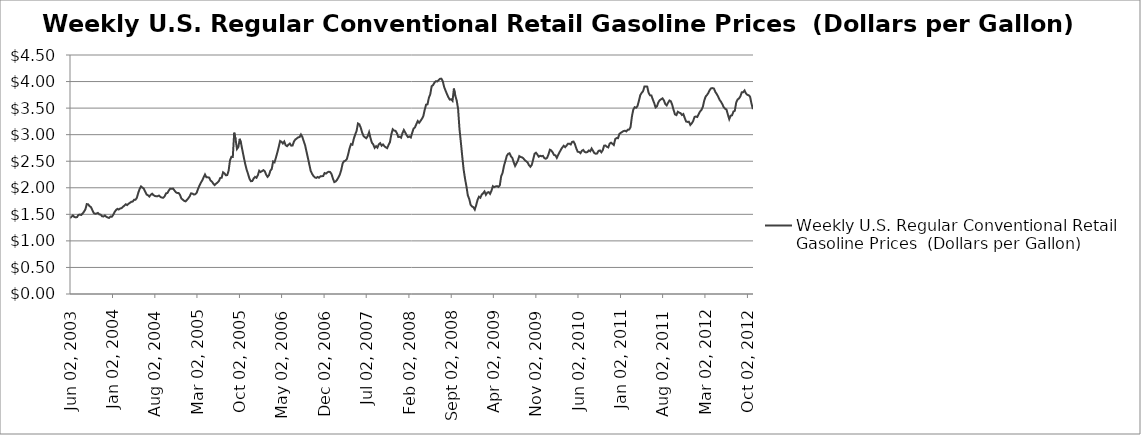
| Category | Weekly U.S. Regular Conventional Retail Gasoline Prices  (Dollars per Gallon) |
|---|---|
| 2003-06-02 | 1.428 |
| 2003-06-09 | 1.456 |
| 2003-06-16 | 1.48 |
| 2003-06-23 | 1.451 |
| 2003-06-30 | 1.443 |
| 2003-07-07 | 1.448 |
| 2003-07-14 | 1.489 |
| 2003-07-21 | 1.496 |
| 2003-07-28 | 1.488 |
| 2003-08-04 | 1.516 |
| 2003-08-11 | 1.55 |
| 2003-08-18 | 1.594 |
| 2003-08-25 | 1.693 |
| 2003-09-01 | 1.688 |
| 2003-09-08 | 1.653 |
| 2003-09-15 | 1.636 |
| 2003-09-22 | 1.58 |
| 2003-09-29 | 1.524 |
| 2003-10-06 | 1.511 |
| 2003-10-13 | 1.515 |
| 2003-10-20 | 1.527 |
| 2003-10-27 | 1.499 |
| 2003-11-03 | 1.494 |
| 2003-11-10 | 1.464 |
| 2003-11-17 | 1.459 |
| 2003-11-24 | 1.478 |
| 2003-12-01 | 1.454 |
| 2003-12-08 | 1.441 |
| 2003-12-15 | 1.433 |
| 2003-12-22 | 1.459 |
| 2003-12-29 | 1.454 |
| 2004-01-05 | 1.492 |
| 2004-01-12 | 1.544 |
| 2004-01-19 | 1.579 |
| 2004-01-26 | 1.604 |
| 2004-02-02 | 1.591 |
| 2004-02-09 | 1.609 |
| 2004-02-16 | 1.617 |
| 2004-02-23 | 1.641 |
| 2004-03-01 | 1.664 |
| 2004-03-08 | 1.69 |
| 2004-03-15 | 1.675 |
| 2004-03-22 | 1.698 |
| 2004-03-29 | 1.716 |
| 2004-04-05 | 1.737 |
| 2004-04-12 | 1.74 |
| 2004-04-19 | 1.773 |
| 2004-04-26 | 1.774 |
| 2004-05-03 | 1.811 |
| 2004-05-10 | 1.904 |
| 2004-05-17 | 1.979 |
| 2004-05-24 | 2.026 |
| 2004-05-31 | 2.004 |
| 2004-06-07 | 1.983 |
| 2004-06-14 | 1.926 |
| 2004-06-21 | 1.873 |
| 2004-06-28 | 1.859 |
| 2004-07-05 | 1.835 |
| 2004-07-12 | 1.869 |
| 2004-07-19 | 1.888 |
| 2004-07-26 | 1.861 |
| 2004-08-02 | 1.846 |
| 2004-08-09 | 1.839 |
| 2004-08-16 | 1.842 |
| 2004-08-23 | 1.854 |
| 2004-08-30 | 1.827 |
| 2004-09-06 | 1.815 |
| 2004-09-13 | 1.813 |
| 2004-09-20 | 1.839 |
| 2004-09-27 | 1.895 |
| 2004-10-04 | 1.902 |
| 2004-10-11 | 1.949 |
| 2004-10-18 | 1.984 |
| 2004-10-25 | 1.98 |
| 2004-11-01 | 1.986 |
| 2004-11-08 | 1.951 |
| 2004-11-15 | 1.918 |
| 2004-11-22 | 1.901 |
| 2004-11-29 | 1.903 |
| 2004-12-06 | 1.868 |
| 2004-12-13 | 1.799 |
| 2004-12-20 | 1.777 |
| 2004-12-27 | 1.754 |
| 2005-01-03 | 1.745 |
| 2005-01-10 | 1.771 |
| 2005-01-17 | 1.802 |
| 2005-01-24 | 1.839 |
| 2005-01-31 | 1.896 |
| 2005-02-07 | 1.89 |
| 2005-02-14 | 1.873 |
| 2005-02-21 | 1.878 |
| 2005-02-28 | 1.904 |
| 2005-03-07 | 1.979 |
| 2005-03-14 | 2.039 |
| 2005-03-21 | 2.095 |
| 2005-03-28 | 2.137 |
| 2005-04-04 | 2.196 |
| 2005-04-11 | 2.251 |
| 2005-04-18 | 2.198 |
| 2005-04-25 | 2.197 |
| 2005-05-02 | 2.191 |
| 2005-05-09 | 2.137 |
| 2005-05-16 | 2.116 |
| 2005-05-23 | 2.077 |
| 2005-05-30 | 2.051 |
| 2005-06-06 | 2.078 |
| 2005-06-13 | 2.099 |
| 2005-06-20 | 2.128 |
| 2005-06-27 | 2.186 |
| 2005-07-04 | 2.189 |
| 2005-07-11 | 2.292 |
| 2005-07-18 | 2.272 |
| 2005-07-25 | 2.235 |
| 2005-08-01 | 2.239 |
| 2005-08-08 | 2.323 |
| 2005-08-15 | 2.519 |
| 2005-08-22 | 2.583 |
| 2005-08-29 | 2.581 |
| 2005-09-05 | 3.037 |
| 2005-09-12 | 2.912 |
| 2005-09-19 | 2.73 |
| 2005-09-26 | 2.767 |
| 2005-10-03 | 2.922 |
| 2005-10-10 | 2.828 |
| 2005-10-17 | 2.693 |
| 2005-10-24 | 2.564 |
| 2005-10-31 | 2.438 |
| 2005-11-07 | 2.336 |
| 2005-11-14 | 2.258 |
| 2005-11-21 | 2.168 |
| 2005-11-28 | 2.124 |
| 2005-12-05 | 2.127 |
| 2005-12-12 | 2.175 |
| 2005-12-19 | 2.205 |
| 2005-12-26 | 2.188 |
| 2006-01-02 | 2.236 |
| 2006-01-09 | 2.321 |
| 2006-01-16 | 2.297 |
| 2006-01-23 | 2.314 |
| 2006-01-30 | 2.332 |
| 2006-02-06 | 2.31 |
| 2006-02-13 | 2.246 |
| 2006-02-20 | 2.205 |
| 2006-02-27 | 2.236 |
| 2006-03-06 | 2.321 |
| 2006-03-13 | 2.355 |
| 2006-03-20 | 2.495 |
| 2006-03-27 | 2.479 |
| 2006-04-03 | 2.567 |
| 2006-04-10 | 2.663 |
| 2006-04-17 | 2.764 |
| 2006-04-24 | 2.881 |
| 2006-05-01 | 2.866 |
| 2006-05-08 | 2.834 |
| 2006-05-15 | 2.871 |
| 2006-05-22 | 2.801 |
| 2006-05-29 | 2.784 |
| 2006-06-05 | 2.811 |
| 2006-06-12 | 2.833 |
| 2006-06-19 | 2.793 |
| 2006-06-26 | 2.796 |
| 2006-07-03 | 2.873 |
| 2006-07-10 | 2.91 |
| 2006-07-17 | 2.928 |
| 2006-07-24 | 2.95 |
| 2006-07-31 | 2.955 |
| 2006-08-07 | 3.004 |
| 2006-08-14 | 2.958 |
| 2006-08-21 | 2.877 |
| 2006-08-28 | 2.8 |
| 2006-09-04 | 2.68 |
| 2006-09-11 | 2.563 |
| 2006-09-18 | 2.441 |
| 2006-09-25 | 2.32 |
| 2006-10-02 | 2.263 |
| 2006-10-09 | 2.222 |
| 2006-10-16 | 2.195 |
| 2006-10-23 | 2.186 |
| 2006-10-30 | 2.204 |
| 2006-11-06 | 2.189 |
| 2006-11-13 | 2.216 |
| 2006-11-20 | 2.218 |
| 2006-11-27 | 2.221 |
| 2006-12-04 | 2.277 |
| 2006-12-11 | 2.267 |
| 2006-12-18 | 2.29 |
| 2006-12-25 | 2.303 |
| 2007-01-01 | 2.296 |
| 2007-01-08 | 2.258 |
| 2007-01-15 | 2.173 |
| 2007-01-22 | 2.107 |
| 2007-01-29 | 2.119 |
| 2007-02-05 | 2.151 |
| 2007-02-12 | 2.198 |
| 2007-02-19 | 2.251 |
| 2007-02-26 | 2.338 |
| 2007-03-05 | 2.46 |
| 2007-03-12 | 2.499 |
| 2007-03-19 | 2.511 |
| 2007-03-26 | 2.54 |
| 2007-04-02 | 2.636 |
| 2007-04-09 | 2.746 |
| 2007-04-16 | 2.822 |
| 2007-04-23 | 2.811 |
| 2007-04-30 | 2.922 |
| 2007-05-07 | 3.002 |
| 2007-05-14 | 3.069 |
| 2007-05-21 | 3.211 |
| 2007-05-28 | 3.195 |
| 2007-06-04 | 3.132 |
| 2007-06-11 | 3.04 |
| 2007-06-18 | 2.974 |
| 2007-06-25 | 2.951 |
| 2007-07-02 | 2.933 |
| 2007-07-09 | 2.971 |
| 2007-07-16 | 3.046 |
| 2007-07-23 | 2.938 |
| 2007-07-30 | 2.849 |
| 2007-08-06 | 2.816 |
| 2007-08-13 | 2.752 |
| 2007-08-20 | 2.783 |
| 2007-08-27 | 2.756 |
| 2007-09-03 | 2.818 |
| 2007-09-10 | 2.84 |
| 2007-09-17 | 2.792 |
| 2007-09-24 | 2.816 |
| 2007-10-01 | 2.784 |
| 2007-10-08 | 2.761 |
| 2007-10-15 | 2.746 |
| 2007-10-22 | 2.806 |
| 2007-10-29 | 2.859 |
| 2007-11-05 | 3.007 |
| 2007-11-12 | 3.101 |
| 2007-11-19 | 3.077 |
| 2007-11-26 | 3.072 |
| 2007-12-03 | 3.029 |
| 2007-12-10 | 2.957 |
| 2007-12-17 | 2.962 |
| 2007-12-24 | 2.943 |
| 2007-12-31 | 3.028 |
| 2008-01-07 | 3.088 |
| 2008-01-14 | 3.041 |
| 2008-01-21 | 2.991 |
| 2008-01-28 | 2.953 |
| 2008-02-04 | 2.966 |
| 2008-02-11 | 2.947 |
| 2008-02-18 | 3.035 |
| 2008-02-25 | 3.115 |
| 2008-03-03 | 3.137 |
| 2008-03-10 | 3.2 |
| 2008-03-17 | 3.257 |
| 2008-03-24 | 3.224 |
| 2008-03-31 | 3.259 |
| 2008-04-07 | 3.299 |
| 2008-04-14 | 3.35 |
| 2008-04-21 | 3.467 |
| 2008-04-28 | 3.566 |
| 2008-05-05 | 3.571 |
| 2008-05-12 | 3.694 |
| 2008-05-19 | 3.762 |
| 2008-05-26 | 3.913 |
| 2008-06-02 | 3.932 |
| 2008-06-09 | 3.979 |
| 2008-06-16 | 4.007 |
| 2008-06-23 | 4.002 |
| 2008-06-30 | 4.027 |
| 2008-07-07 | 4.051 |
| 2008-07-14 | 4.054 |
| 2008-07-21 | 4.005 |
| 2008-07-28 | 3.896 |
| 2008-08-04 | 3.828 |
| 2008-08-11 | 3.764 |
| 2008-08-18 | 3.706 |
| 2008-08-25 | 3.66 |
| 2008-09-01 | 3.667 |
| 2008-09-08 | 3.637 |
| 2008-09-15 | 3.867 |
| 2008-09-22 | 3.732 |
| 2008-09-29 | 3.644 |
| 2008-10-06 | 3.485 |
| 2008-10-13 | 3.109 |
| 2008-10-20 | 2.855 |
| 2008-10-27 | 2.589 |
| 2008-11-03 | 2.34 |
| 2008-11-10 | 2.17 |
| 2008-11-17 | 2.027 |
| 2008-11-24 | 1.857 |
| 2008-12-01 | 1.79 |
| 2008-12-08 | 1.681 |
| 2008-12-15 | 1.648 |
| 2008-12-22 | 1.635 |
| 2008-12-29 | 1.59 |
| 2009-01-05 | 1.672 |
| 2009-01-12 | 1.772 |
| 2009-01-19 | 1.832 |
| 2009-01-26 | 1.813 |
| 2009-02-02 | 1.871 |
| 2009-02-09 | 1.897 |
| 2009-02-16 | 1.931 |
| 2009-02-23 | 1.868 |
| 2009-03-02 | 1.91 |
| 2009-03-09 | 1.918 |
| 2009-03-16 | 1.885 |
| 2009-03-23 | 1.944 |
| 2009-03-30 | 2.03 |
| 2009-04-06 | 2.011 |
| 2009-04-13 | 2.025 |
| 2009-04-20 | 2.031 |
| 2009-04-27 | 2.016 |
| 2009-05-04 | 2.045 |
| 2009-05-11 | 2.218 |
| 2009-05-18 | 2.281 |
| 2009-05-25 | 2.414 |
| 2009-06-01 | 2.502 |
| 2009-06-08 | 2.6 |
| 2009-06-15 | 2.639 |
| 2009-06-22 | 2.65 |
| 2009-06-29 | 2.593 |
| 2009-07-06 | 2.563 |
| 2009-07-13 | 2.479 |
| 2009-07-20 | 2.411 |
| 2009-07-27 | 2.46 |
| 2009-08-03 | 2.511 |
| 2009-08-10 | 2.596 |
| 2009-08-17 | 2.58 |
| 2009-08-24 | 2.572 |
| 2009-08-31 | 2.553 |
| 2009-09-07 | 2.519 |
| 2009-09-14 | 2.499 |
| 2009-09-21 | 2.477 |
| 2009-09-28 | 2.425 |
| 2009-10-05 | 2.396 |
| 2009-10-12 | 2.432 |
| 2009-10-19 | 2.532 |
| 2009-10-26 | 2.641 |
| 2009-11-02 | 2.66 |
| 2009-11-09 | 2.627 |
| 2009-11-16 | 2.585 |
| 2009-11-23 | 2.603 |
| 2009-11-30 | 2.594 |
| 2009-12-07 | 2.601 |
| 2009-12-14 | 2.56 |
| 2009-12-21 | 2.546 |
| 2009-12-28 | 2.564 |
| 2010-01-04 | 2.627 |
| 2010-01-11 | 2.717 |
| 2010-01-18 | 2.703 |
| 2010-01-25 | 2.666 |
| 2010-02-01 | 2.618 |
| 2010-02-08 | 2.611 |
| 2010-02-15 | 2.563 |
| 2010-02-22 | 2.621 |
| 2010-03-01 | 2.671 |
| 2010-03-08 | 2.721 |
| 2010-03-15 | 2.76 |
| 2010-03-22 | 2.792 |
| 2010-03-29 | 2.765 |
| 2010-04-05 | 2.795 |
| 2010-04-12 | 2.829 |
| 2010-04-19 | 2.831 |
| 2010-04-26 | 2.815 |
| 2010-05-03 | 2.864 |
| 2010-05-10 | 2.87 |
| 2010-05-17 | 2.823 |
| 2010-05-24 | 2.741 |
| 2010-05-31 | 2.679 |
| 2010-06-07 | 2.674 |
| 2010-06-14 | 2.652 |
| 2010-06-21 | 2.696 |
| 2010-06-28 | 2.712 |
| 2010-07-05 | 2.676 |
| 2010-07-12 | 2.666 |
| 2010-07-19 | 2.672 |
| 2010-07-26 | 2.703 |
| 2010-08-02 | 2.687 |
| 2010-08-09 | 2.74 |
| 2010-08-16 | 2.696 |
| 2010-08-23 | 2.653 |
| 2010-08-30 | 2.64 |
| 2010-09-06 | 2.647 |
| 2010-09-13 | 2.695 |
| 2010-09-20 | 2.703 |
| 2010-09-27 | 2.668 |
| 2010-10-04 | 2.705 |
| 2010-10-11 | 2.793 |
| 2010-10-18 | 2.795 |
| 2010-10-25 | 2.772 |
| 2010-11-01 | 2.76 |
| 2010-11-08 | 2.832 |
| 2010-11-15 | 2.849 |
| 2010-11-22 | 2.828 |
| 2010-11-29 | 2.805 |
| 2010-12-06 | 2.917 |
| 2010-12-13 | 2.937 |
| 2010-12-20 | 2.934 |
| 2010-12-27 | 3.015 |
| 2011-01-03 | 3.034 |
| 2011-01-10 | 3.052 |
| 2011-01-17 | 3.068 |
| 2011-01-24 | 3.074 |
| 2011-01-31 | 3.061 |
| 2011-02-07 | 3.094 |
| 2011-02-14 | 3.095 |
| 2011-02-21 | 3.141 |
| 2011-02-28 | 3.341 |
| 2011-03-07 | 3.473 |
| 2011-03-14 | 3.517 |
| 2011-03-21 | 3.507 |
| 2011-03-28 | 3.538 |
| 2011-04-04 | 3.635 |
| 2011-04-11 | 3.743 |
| 2011-04-18 | 3.787 |
| 2011-04-25 | 3.817 |
| 2011-05-02 | 3.906 |
| 2011-05-09 | 3.907 |
| 2011-05-16 | 3.905 |
| 2011-05-23 | 3.788 |
| 2011-05-30 | 3.741 |
| 2011-06-06 | 3.738 |
| 2011-06-13 | 3.664 |
| 2011-06-20 | 3.597 |
| 2011-06-27 | 3.513 |
| 2011-07-04 | 3.534 |
| 2011-07-11 | 3.608 |
| 2011-07-18 | 3.648 |
| 2011-07-25 | 3.667 |
| 2011-08-01 | 3.684 |
| 2011-08-08 | 3.646 |
| 2011-08-15 | 3.576 |
| 2011-08-22 | 3.552 |
| 2011-08-29 | 3.601 |
| 2011-09-05 | 3.643 |
| 2011-09-12 | 3.629 |
| 2011-09-19 | 3.56 |
| 2011-09-26 | 3.461 |
| 2011-10-03 | 3.381 |
| 2011-10-10 | 3.368 |
| 2011-10-17 | 3.431 |
| 2011-10-24 | 3.415 |
| 2011-10-31 | 3.405 |
| 2011-11-07 | 3.37 |
| 2011-11-14 | 3.388 |
| 2011-11-21 | 3.312 |
| 2011-11-28 | 3.248 |
| 2011-12-05 | 3.24 |
| 2011-12-12 | 3.244 |
| 2011-12-19 | 3.183 |
| 2011-12-26 | 3.213 |
| 2012-01-02 | 3.254 |
| 2012-01-09 | 3.333 |
| 2012-01-16 | 3.342 |
| 2012-01-23 | 3.333 |
| 2012-01-30 | 3.386 |
| 2012-02-06 | 3.436 |
| 2012-02-13 | 3.466 |
| 2012-02-20 | 3.523 |
| 2012-02-27 | 3.641 |
| 2012-03-05 | 3.717 |
| 2012-03-12 | 3.747 |
| 2012-03-19 | 3.787 |
| 2012-03-26 | 3.843 |
| 2012-04-02 | 3.874 |
| 2012-04-09 | 3.877 |
| 2012-04-16 | 3.867 |
| 2012-04-23 | 3.805 |
| 2012-04-30 | 3.764 |
| 2012-05-07 | 3.718 |
| 2012-05-14 | 3.658 |
| 2012-05-21 | 3.622 |
| 2012-05-28 | 3.575 |
| 2012-06-04 | 3.518 |
| 2012-06-11 | 3.489 |
| 2012-06-18 | 3.473 |
| 2012-06-25 | 3.378 |
| 2012-07-02 | 3.291 |
| 2012-07-09 | 3.357 |
| 2012-07-16 | 3.364 |
| 2012-07-23 | 3.435 |
| 2012-07-30 | 3.45 |
| 2012-08-06 | 3.606 |
| 2012-08-13 | 3.662 |
| 2012-08-20 | 3.682 |
| 2012-08-27 | 3.722 |
| 2012-09-03 | 3.797 |
| 2012-09-10 | 3.799 |
| 2012-09-17 | 3.832 |
| 2012-09-24 | 3.775 |
| 2012-10-01 | 3.75 |
| 2012-10-08 | 3.742 |
| 2012-10-15 | 3.713 |
| 2012-10-22 | 3.582 |
| 2012-10-29 | 3.48 |